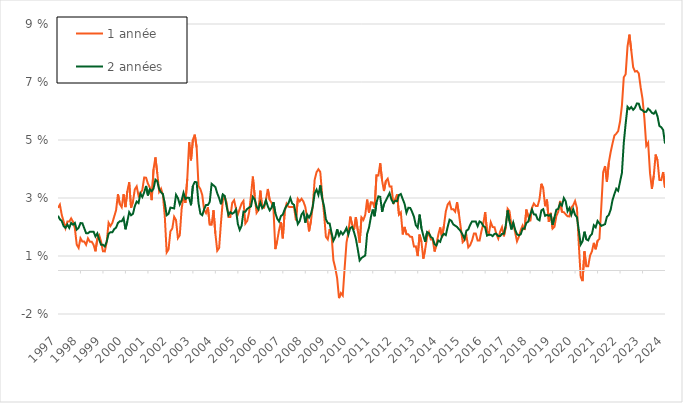
| Category | 1 année | 2 années |
|---|---|---|
| 1997-01-01 | 0.022 | 0.019 |
| 1997-02-01 | 0.023 | 0.018 |
| 1997-03-01 | 0.019 | 0.017 |
| 1997-04-01 | 0.017 | 0.015 |
| 1997-05-01 | 0.015 | 0.015 |
| 1997-06-01 | 0.017 | 0.016 |
| 1997-07-01 | 0.017 | 0.015 |
| 1997-08-01 | 0.018 | 0.016 |
| 1997-09-01 | 0.017 | 0.016 |
| 1997-10-01 | 0.015 | 0.016 |
| 1997-11-01 | 0.009 | 0.014 |
| 1997-12-01 | 0.008 | 0.015 |
| 1998-01-01 | 0.011 | 0.016 |
| 1998-02-01 | 0.01 | 0.016 |
| 1998-03-01 | 0.01 | 0.015 |
| 1998-04-01 | 0.009 | 0.013 |
| 1998-05-01 | 0.011 | 0.013 |
| 1998-06-01 | 0.01 | 0.013 |
| 1998-07-01 | 0.01 | 0.013 |
| 1998-08-01 | 0.009 | 0.013 |
| 1998-09-01 | 0.007 | 0.012 |
| 1998-10-01 | 0.011 | 0.013 |
| 1998-11-01 | 0.012 | 0.011 |
| 1998-12-01 | 0.01 | 0.009 |
| 1999-01-01 | 0.007 | 0.009 |
| 1999-02-01 | 0.007 | 0.008 |
| 1999-03-01 | 0.01 | 0.01 |
| 1999-04-01 | 0.016 | 0.013 |
| 1999-05-01 | 0.015 | 0.013 |
| 1999-06-01 | 0.016 | 0.013 |
| 1999-07-01 | 0.019 | 0.014 |
| 1999-08-01 | 0.021 | 0.015 |
| 1999-09-01 | 0.026 | 0.016 |
| 1999-10-01 | 0.023 | 0.017 |
| 1999-11-01 | 0.022 | 0.017 |
| 1999-12-01 | 0.026 | 0.018 |
| 2000-01-01 | 0.022 | 0.014 |
| 2000-02-01 | 0.027 | 0.017 |
| 2000-03-01 | 0.03 | 0.02 |
| 2000-04-01 | 0.022 | 0.019 |
| 2000-05-01 | 0.024 | 0.02 |
| 2000-06-01 | 0.028 | 0.022 |
| 2000-07-01 | 0.029 | 0.024 |
| 2000-08-01 | 0.026 | 0.023 |
| 2000-09-01 | 0.027 | 0.027 |
| 2000-10-01 | 0.028 | 0.025 |
| 2000-11-01 | 0.032 | 0.027 |
| 2000-12-01 | 0.032 | 0.029 |
| 2001-01-01 | 0.03 | 0.026 |
| 2001-02-01 | 0.029 | 0.028 |
| 2001-03-01 | 0.024 | 0.027 |
| 2001-04-01 | 0.035 | 0.028 |
| 2001-05-01 | 0.039 | 0.031 |
| 2001-06-01 | 0.034 | 0.031 |
| 2001-07-01 | 0.027 | 0.028 |
| 2001-08-01 | 0.028 | 0.027 |
| 2001-09-01 | 0.026 | 0.026 |
| 2001-10-01 | 0.019 | 0.023 |
| 2001-11-01 | 0.006 | 0.019 |
| 2001-12-01 | 0.007 | 0.02 |
| 2002-01-01 | 0.013 | 0.022 |
| 2002-02-01 | 0.014 | 0.022 |
| 2002-03-01 | 0.019 | 0.021 |
| 2002-04-01 | 0.017 | 0.026 |
| 2002-05-01 | 0.011 | 0.025 |
| 2002-06-01 | 0.012 | 0.023 |
| 2002-07-01 | 0.021 | 0.024 |
| 2002-08-01 | 0.025 | 0.027 |
| 2002-09-01 | 0.023 | 0.025 |
| 2002-10-01 | 0.032 | 0.025 |
| 2002-11-01 | 0.044 | 0.025 |
| 2002-12-01 | 0.038 | 0.022 |
| 2003-01-01 | 0.045 | 0.029 |
| 2003-02-01 | 0.047 | 0.031 |
| 2003-03-01 | 0.042 | 0.03 |
| 2003-04-01 | 0.029 | 0.023 |
| 2003-05-01 | 0.028 | 0.02 |
| 2003-06-01 | 0.026 | 0.019 |
| 2003-07-01 | 0.021 | 0.021 |
| 2003-08-01 | 0.02 | 0.023 |
| 2003-09-01 | 0.022 | 0.023 |
| 2003-10-01 | 0.016 | 0.024 |
| 2003-11-01 | 0.016 | 0.03 |
| 2003-12-01 | 0.021 | 0.029 |
| 2004-01-01 | 0.013 | 0.029 |
| 2004-02-01 | 0.007 | 0.027 |
| 2004-03-01 | 0.008 | 0.025 |
| 2004-04-01 | 0.017 | 0.023 |
| 2004-05-01 | 0.024 | 0.026 |
| 2004-06-01 | 0.025 | 0.026 |
| 2004-07-01 | 0.023 | 0.022 |
| 2004-08-01 | 0.018 | 0.019 |
| 2004-09-01 | 0.018 | 0.02 |
| 2004-10-01 | 0.023 | 0.02 |
| 2004-11-01 | 0.024 | 0.02 |
| 2004-12-01 | 0.021 | 0.021 |
| 2005-01-01 | 0.019 | 0.016 |
| 2005-02-01 | 0.021 | 0.014 |
| 2005-03-01 | 0.023 | 0.015 |
| 2005-04-01 | 0.024 | 0.02 |
| 2005-05-01 | 0.016 | 0.02 |
| 2005-06-01 | 0.017 | 0.021 |
| 2005-07-01 | 0.02 | 0.022 |
| 2005-08-01 | 0.026 | 0.022 |
| 2005-09-01 | 0.032 | 0.025 |
| 2005-10-01 | 0.026 | 0.025 |
| 2005-11-01 | 0.02 | 0.022 |
| 2005-12-01 | 0.021 | 0.021 |
| 2006-01-01 | 0.028 | 0.023 |
| 2006-02-01 | 0.022 | 0.022 |
| 2006-03-01 | 0.022 | 0.022 |
| 2006-04-01 | 0.024 | 0.024 |
| 2006-05-01 | 0.028 | 0.022 |
| 2006-06-01 | 0.024 | 0.021 |
| 2006-07-01 | 0.023 | 0.022 |
| 2006-08-01 | 0.021 | 0.024 |
| 2006-09-01 | 0.007 | 0.02 |
| 2006-10-01 | 0.01 | 0.018 |
| 2006-11-01 | 0.014 | 0.017 |
| 2006-12-01 | 0.017 | 0.019 |
| 2007-01-01 | 0.011 | 0.019 |
| 2007-02-01 | 0.02 | 0.021 |
| 2007-03-01 | 0.023 | 0.022 |
| 2007-04-01 | 0.022 | 0.023 |
| 2007-05-01 | 0.022 | 0.025 |
| 2007-06-01 | 0.022 | 0.023 |
| 2007-07-01 | 0.022 | 0.023 |
| 2007-08-01 | 0.017 | 0.019 |
| 2007-09-01 | 0.025 | 0.016 |
| 2007-10-01 | 0.024 | 0.017 |
| 2007-11-01 | 0.025 | 0.019 |
| 2007-12-01 | 0.024 | 0.02 |
| 2008-01-01 | 0.022 | 0.016 |
| 2008-02-01 | 0.018 | 0.019 |
| 2008-03-01 | 0.014 | 0.018 |
| 2008-04-01 | 0.017 | 0.019 |
| 2008-05-01 | 0.022 | 0.022 |
| 2008-06-01 | 0.031 | 0.027 |
| 2008-07-01 | 0.034 | 0.028 |
| 2008-08-01 | 0.035 | 0.026 |
| 2008-09-01 | 0.034 | 0.029 |
| 2008-10-01 | 0.026 | 0.025 |
| 2008-11-01 | 0.02 | 0.022 |
| 2008-12-01 | 0.012 | 0.018 |
| 2009-01-01 | 0.011 | 0.016 |
| 2009-02-01 | 0.014 | 0.016 |
| 2009-03-01 | 0.012 | 0.013 |
| 2009-04-01 | 0.004 | 0.01 |
| 2009-05-01 | 0.001 | 0.012 |
| 2009-06-01 | -0.003 | 0.014 |
| 2009-07-01 | -0.009 | 0.012 |
| 2009-08-01 | -0.008 | 0.013 |
| 2009-09-01 | -0.009 | 0.012 |
| 2009-10-01 | 0.001 | 0.013 |
| 2009-11-01 | 0.01 | 0.015 |
| 2009-12-01 | 0.013 | 0.012 |
| 2010-01-01 | 0.019 | 0.015 |
| 2010-02-01 | 0.016 | 0.015 |
| 2010-03-01 | 0.014 | 0.013 |
| 2010-04-01 | 0.018 | 0.011 |
| 2010-05-01 | 0.014 | 0.007 |
| 2010-06-01 | 0.01 | 0.003 |
| 2010-07-01 | 0.018 | 0.004 |
| 2010-08-01 | 0.017 | 0.005 |
| 2010-09-01 | 0.019 | 0.005 |
| 2010-10-01 | 0.024 | 0.013 |
| 2010-11-01 | 0.02 | 0.015 |
| 2010-12-01 | 0.024 | 0.018 |
| 2011-01-01 | 0.023 | 0.021 |
| 2011-02-01 | 0.022 | 0.019 |
| 2011-03-01 | 0.033 | 0.023 |
| 2011-04-01 | 0.033 | 0.026 |
| 2011-05-01 | 0.037 | 0.025 |
| 2011-06-01 | 0.031 | 0.02 |
| 2011-07-01 | 0.027 | 0.023 |
| 2011-08-01 | 0.031 | 0.024 |
| 2011-09-01 | 0.032 | 0.025 |
| 2011-10-01 | 0.029 | 0.027 |
| 2011-11-01 | 0.029 | 0.024 |
| 2011-12-01 | 0.023 | 0.023 |
| 2012-01-01 | 0.025 | 0.024 |
| 2012-02-01 | 0.026 | 0.024 |
| 2012-03-01 | 0.019 | 0.026 |
| 2012-04-01 | 0.02 | 0.026 |
| 2012-05-01 | 0.012 | 0.025 |
| 2012-06-01 | 0.015 | 0.023 |
| 2012-07-01 | 0.012 | 0.02 |
| 2012-08-01 | 0.012 | 0.022 |
| 2012-09-01 | 0.012 | 0.022 |
| 2012-10-01 | 0.012 | 0.02 |
| 2012-11-01 | 0.008 | 0.019 |
| 2012-12-01 | 0.008 | 0.016 |
| 2013-01-01 | 0.005 | 0.015 |
| 2013-02-01 | 0.012 | 0.019 |
| 2013-03-01 | 0.01 | 0.015 |
| 2013-04-01 | 0.004 | 0.012 |
| 2013-05-01 | 0.007 | 0.01 |
| 2013-06-01 | 0.012 | 0.013 |
| 2013-07-01 | 0.013 | 0.013 |
| 2013-08-01 | 0.011 | 0.012 |
| 2013-09-01 | 0.011 | 0.011 |
| 2013-10-01 | 0.007 | 0.009 |
| 2013-11-01 | 0.009 | 0.009 |
| 2013-12-01 | 0.012 | 0.01 |
| 2014-01-01 | 0.015 | 0.01 |
| 2014-02-01 | 0.011 | 0.012 |
| 2014-03-01 | 0.015 | 0.013 |
| 2014-04-01 | 0.02 | 0.012 |
| 2014-05-01 | 0.023 | 0.015 |
| 2014-06-01 | 0.024 | 0.018 |
| 2014-07-01 | 0.021 | 0.017 |
| 2014-08-01 | 0.021 | 0.016 |
| 2014-09-01 | 0.02 | 0.015 |
| 2014-10-01 | 0.024 | 0.015 |
| 2014-11-01 | 0.02 | 0.014 |
| 2014-12-01 | 0.015 | 0.014 |
| 2015-01-01 | 0.01 | 0.012 |
| 2015-02-01 | 0.01 | 0.011 |
| 2015-03-01 | 0.012 | 0.014 |
| 2015-04-01 | 0.008 | 0.014 |
| 2015-05-01 | 0.009 | 0.016 |
| 2015-06-01 | 0.01 | 0.017 |
| 2015-07-01 | 0.013 | 0.017 |
| 2015-08-01 | 0.013 | 0.017 |
| 2015-09-01 | 0.01 | 0.015 |
| 2015-10-01 | 0.01 | 0.017 |
| 2015-11-01 | 0.014 | 0.017 |
| 2015-12-01 | 0.016 | 0.015 |
| 2016-01-01 | 0.02 | 0.015 |
| 2016-02-01 | 0.014 | 0.012 |
| 2016-03-01 | 0.013 | 0.012 |
| 2016-04-01 | 0.017 | 0.012 |
| 2016-05-01 | 0.015 | 0.012 |
| 2016-06-01 | 0.015 | 0.013 |
| 2016-07-01 | 0.013 | 0.013 |
| 2016-08-01 | 0.011 | 0.012 |
| 2016-09-01 | 0.013 | 0.012 |
| 2016-10-01 | 0.015 | 0.013 |
| 2016-11-01 | 0.012 | 0.013 |
| 2016-12-01 | 0.015 | 0.016 |
| 2017-01-01 | 0.021 | 0.021 |
| 2017-02-01 | 0.02 | 0.017 |
| 2017-03-01 | 0.016 | 0.014 |
| 2017-04-01 | 0.016 | 0.017 |
| 2017-05-01 | 0.013 | 0.014 |
| 2017-06-01 | 0.01 | 0.013 |
| 2017-07-01 | 0.012 | 0.012 |
| 2017-08-01 | 0.014 | 0.012 |
| 2017-09-01 | 0.016 | 0.014 |
| 2017-10-01 | 0.014 | 0.014 |
| 2017-11-01 | 0.021 | 0.016 |
| 2017-12-01 | 0.019 | 0.017 |
| 2018-01-01 | 0.017 | 0.019 |
| 2018-02-01 | 0.022 | 0.021 |
| 2018-03-01 | 0.023 | 0.019 |
| 2018-04-01 | 0.022 | 0.019 |
| 2018-05-01 | 0.022 | 0.018 |
| 2018-06-01 | 0.025 | 0.017 |
| 2018-07-01 | 0.03 | 0.021 |
| 2018-08-01 | 0.028 | 0.021 |
| 2018-09-01 | 0.022 | 0.019 |
| 2018-10-01 | 0.024 | 0.019 |
| 2018-11-01 | 0.017 | 0.019 |
| 2018-12-01 | 0.02 | 0.019 |
| 2019-01-01 | 0.014 | 0.016 |
| 2019-02-01 | 0.015 | 0.018 |
| 2019-03-01 | 0.019 | 0.021 |
| 2019-04-01 | 0.02 | 0.021 |
| 2019-05-01 | 0.024 | 0.023 |
| 2019-06-01 | 0.02 | 0.022 |
| 2019-07-01 | 0.02 | 0.025 |
| 2019-08-01 | 0.019 | 0.024 |
| 2019-09-01 | 0.019 | 0.02 |
| 2019-10-01 | 0.019 | 0.022 |
| 2019-11-01 | 0.022 | 0.019 |
| 2019-12-01 | 0.022 | 0.021 |
| 2020-01-01 | 0.024 | 0.019 |
| 2020-02-01 | 0.022 | 0.018 |
| 2020-03-01 | 0.009 | 0.014 |
| 2020-04-01 | -0.002 | 0.009 |
| 2020-05-01 | -0.004 | 0.01 |
| 2020-06-01 | 0.007 | 0.013 |
| 2020-07-01 | 0.001 | 0.011 |
| 2020-08-01 | 0.001 | 0.01 |
| 2020-09-01 | 0.005 | 0.012 |
| 2020-10-01 | 0.007 | 0.013 |
| 2020-11-01 | 0.01 | 0.016 |
| 2020-12-01 | 0.007 | 0.015 |
| 2021-01-01 | 0.01 | 0.017 |
| 2021-02-01 | 0.011 | 0.016 |
| 2021-03-01 | 0.022 | 0.015 |
| 2021-04-01 | 0.034 | 0.016 |
| 2021-05-01 | 0.036 | 0.016 |
| 2021-06-01 | 0.031 | 0.019 |
| 2021-07-01 | 0.037 | 0.019 |
| 2021-08-01 | 0.041 | 0.021 |
| 2021-09-01 | 0.044 | 0.024 |
| 2021-10-01 | 0.047 | 0.026 |
| 2021-11-01 | 0.047 | 0.028 |
| 2021-12-01 | 0.048 | 0.027 |
| 2022-01-01 | 0.051 | 0.031 |
| 2022-02-01 | 0.057 | 0.034 |
| 2022-03-01 | 0.067 | 0.044 |
| 2022-04-01 | 0.068 | 0.051 |
| 2022-05-01 | 0.077 | 0.056 |
| 2022-06-01 | 0.081 | 0.056 |
| 2022-07-01 | 0.076 | 0.056 |
| 2022-08-01 | 0.07 | 0.055 |
| 2022-09-01 | 0.069 | 0.056 |
| 2022-10-01 | 0.069 | 0.058 |
| 2022-11-01 | 0.068 | 0.058 |
| 2022-12-01 | 0.063 | 0.056 |
| 2023-01-01 | 0.059 | 0.055 |
| 2023-02-01 | 0.052 | 0.055 |
| 2023-03-01 | 0.043 | 0.055 |
| 2023-04-01 | 0.044 | 0.056 |
| 2023-05-01 | 0.034 | 0.055 |
| 2023-06-01 | 0.028 | 0.054 |
| 2023-07-01 | 0.033 | 0.054 |
| 2023-08-01 | 0.04 | 0.055 |
| 2023-09-01 | 0.038 | 0.053 |
| 2023-10-01 | 0.031 | 0.05 |
| 2023-11-01 | 0.031 | 0.049 |
| 2023-12-01 | 0.034 | 0.048 |
| 2024-01-01 | 0.029 | 0.044 |